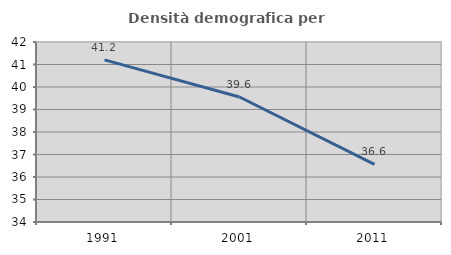
| Category | Densità demografica |
|---|---|
| 1991.0 | 41.208 |
| 2001.0 | 39.557 |
| 2011.0 | 36.558 |